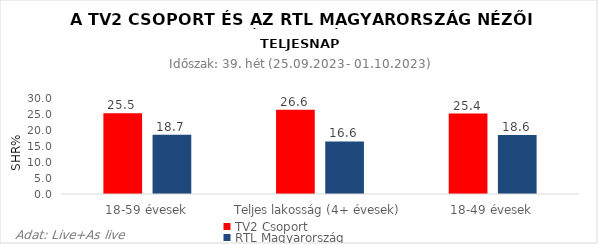
| Category | TV2 Csoport | RTL Magyarország |
|---|---|---|
| 18-59 évesek | 25.5 | 18.7 |
| Teljes lakosság (4+ évesek) | 26.6 | 16.6 |
| 18-49 évesek | 25.4 | 18.6 |